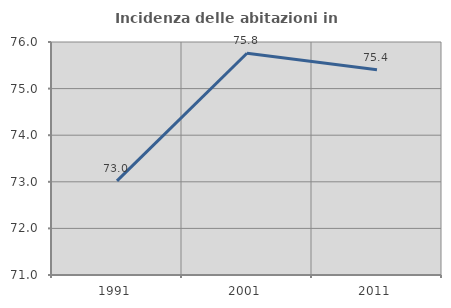
| Category | Incidenza delle abitazioni in proprietà  |
|---|---|
| 1991.0 | 73.021 |
| 2001.0 | 75.759 |
| 2011.0 | 75.406 |